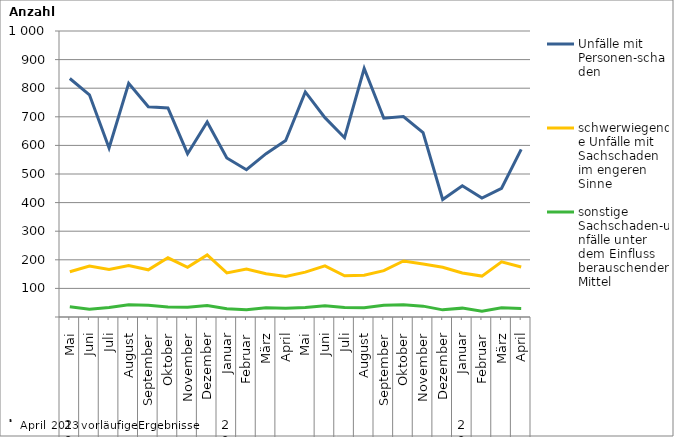
| Category | Unfälle mit Personen-schaden | schwerwiegende Unfälle mit Sachschaden   im engeren Sinne | sonstige Sachschaden-unfälle unter dem Einfluss berauschender Mittel |
|---|---|---|---|
| 0 | 834 | 158 | 36 |
| 1 | 777 | 178 | 27 |
| 2 | 591 | 166 | 33 |
| 3 | 817 | 180 | 43 |
| 4 | 735 | 165 | 41 |
| 5 | 731 | 207 | 35 |
| 6 | 571 | 174 | 34 |
| 7 | 682 | 217 | 40 |
| 8 | 556 | 154 | 29 |
| 9 | 515 | 168 | 25 |
| 10 | 571 | 151 | 32 |
| 11 | 617 | 142 | 31 |
| 12 | 787 | 157 | 33 |
| 13 | 697 | 179 | 39 |
| 14 | 627 | 144 | 33 |
| 15 | 869 | 146 | 32 |
| 16 | 695 | 162 | 41 |
| 17 | 701 | 196 | 43 |
| 18 | 645 | 185 | 38 |
| 19 | 411 | 174 | 25 |
| 20 | 459 | 154 | 31 |
| 21 | 416 | 143 | 20 |
| 22 | 450 | 193 | 32 |
| 23 | 586 | 175 | 30 |